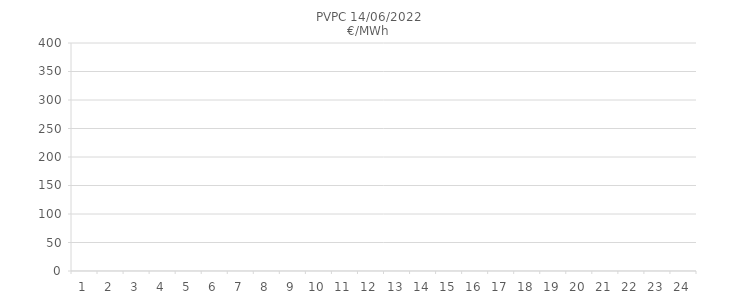
| Category | PVPC 14/06/2022
€/MWh |
|---|---|
| 1.0 | 266.95 |
| 2.0 | 266.34 |
| 3.0 | 254.41 |
| 4.0 | 249.73 |
| 5.0 | 244.74 |
| 6.0 | 248.96 |
| 7.0 | 261.12 |
| 8.0 | 274.29 |
| 9.0 | 300.68 |
| 10.0 | 291.95 |
| 11.0 | 332.44 |
| 12.0 | 317.75 |
| 13.0 | 313.79 |
| 14.0 | 313.36 |
| 15.0 | 265.42 |
| 16.0 | 258.4 |
| 17.0 | 268.77 |
| 18.0 | 271.23 |
| 19.0 | 325.92 |
| 20.0 | 340.65 |
| 21.0 | 361.8 |
| 22.0 | 366.25 |
| 23.0 | 309.93 |
| 24.0 | 292.87 |